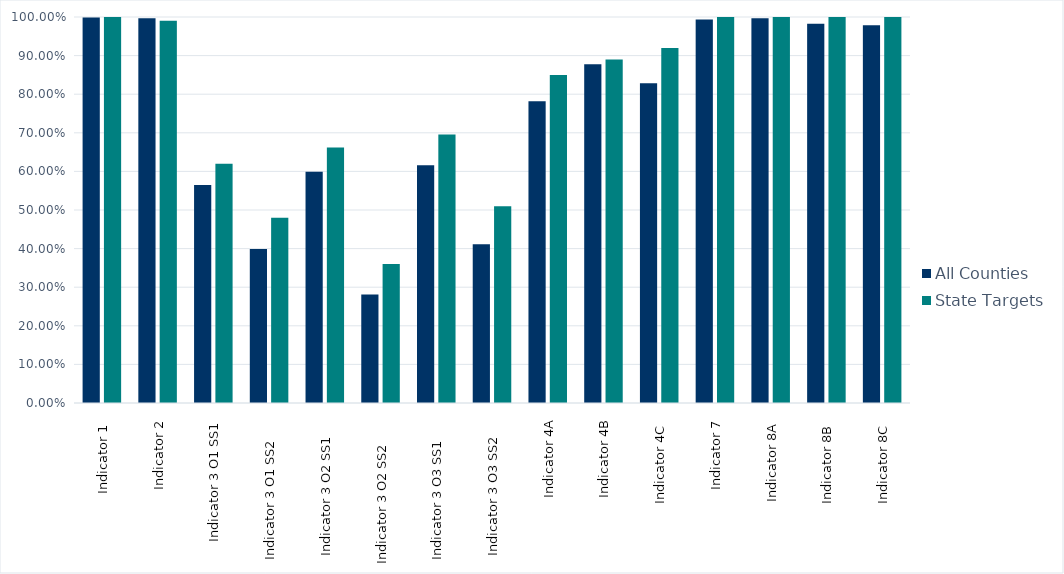
| Category | All Counties | State Targets |
|---|---|---|
| Indicator 1  | 0.999 | 1 |
| Indicator 2 | 0.997 | 0.99 |
| Indicator 3 O1 SS1 | 0.565 | 0.62 |
| Indicator 3 O1 SS2     | 0.399 | 0.48 |
| Indicator 3 O2 SS1    | 0.599 | 0.662 |
| Indicator 3 O2 SS2      | 0.281 | 0.36 |
| Indicator 3 O3 SS1     | 0.616 | 0.696 |
| Indicator 3 O3 SS2    | 0.411 | 0.51 |
| Indicator 4A | 0.782 | 0.85 |
| Indicator 4B | 0.877 | 0.89 |
| Indicator 4C  | 0.828 | 0.92 |
| Indicator 7 | 0.994 | 1 |
| Indicator 8A  | 0.997 | 1 |
| Indicator 8B  | 0.983 | 1 |
| Indicator 8C  | 0.979 | 1 |